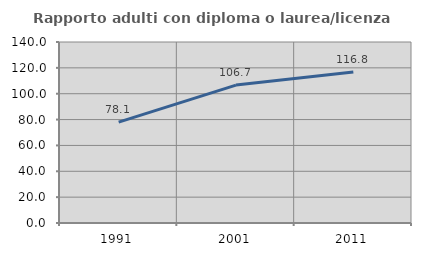
| Category | Rapporto adulti con diploma o laurea/licenza media  |
|---|---|
| 1991.0 | 78.078 |
| 2001.0 | 106.685 |
| 2011.0 | 116.838 |